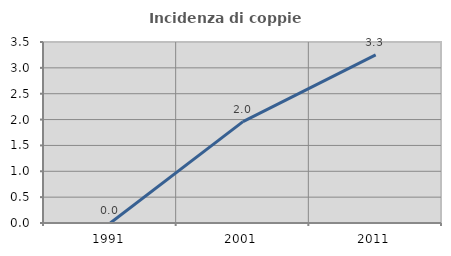
| Category | Incidenza di coppie miste |
|---|---|
| 1991.0 | 0 |
| 2001.0 | 1.961 |
| 2011.0 | 3.252 |